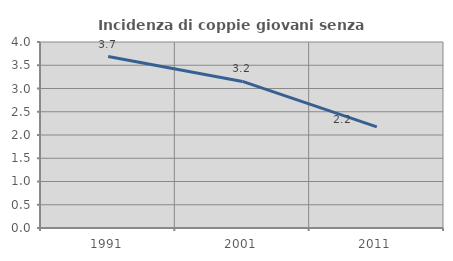
| Category | Incidenza di coppie giovani senza figli |
|---|---|
| 1991.0 | 3.687 |
| 2001.0 | 3.152 |
| 2011.0 | 2.175 |